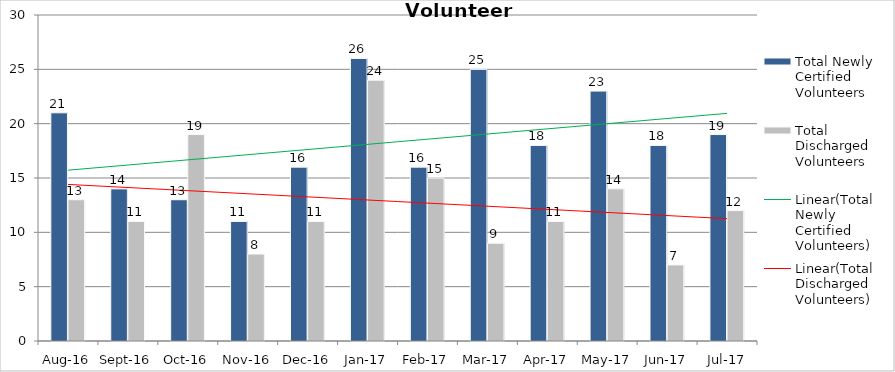
| Category | Total Newly Certified Volunteers | Total Discharged Volunteers |
|---|---|---|
| Aug-16 | 21 | 13 |
| Sep-16 | 14 | 11 |
| Oct-16 | 13 | 19 |
| Nov-16 | 11 | 8 |
| Dec-16 | 16 | 11 |
| Jan-17 | 26 | 24 |
| Feb-17 | 16 | 15 |
| Mar-17 | 25 | 9 |
| Apr-17 | 18 | 11 |
| May-17 | 23 | 14 |
| Jun-17 | 18 | 7 |
| Jul-17 | 19 | 12 |